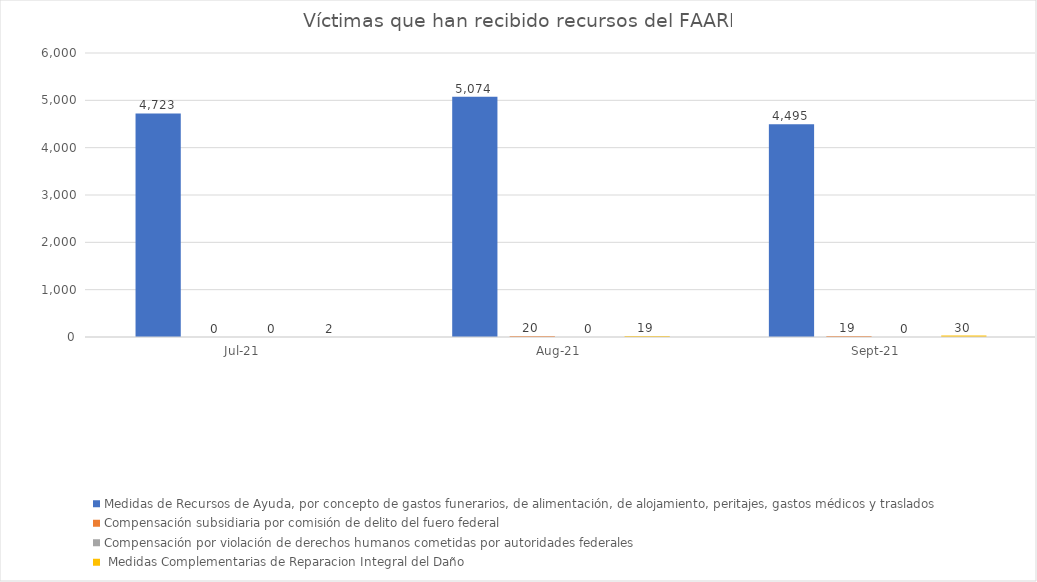
| Category | Medidas de Recursos de Ayuda, por concepto de gastos funerarios, de alimentación, de alojamiento, peritajes, gastos médicos y traslados | Compensación subsidiaria por comisión de delito del fuero federal | Compensación por violación de derechos humanos cometidas por autoridades federales |  Medidas Complementarias de Reparacion Integral del Daño |
|---|---|---|---|---|
| 2021-07-01 | 4723 | 0 | 0 | 2 |
| 2021-08-01 | 5074 | 20 | 0 | 19 |
| 2021-09-01 | 4495 | 19 | 0 | 30 |